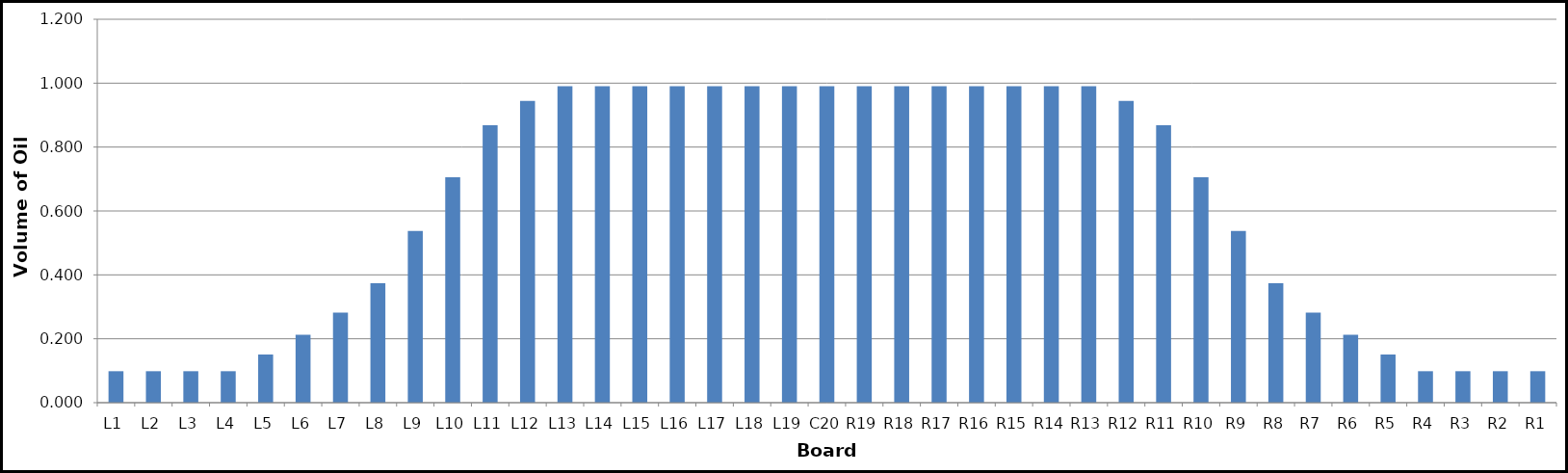
| Category | Series 0 |
|---|---|
| L1 | 0.099 |
| L2 | 0.099 |
| L3 | 0.099 |
| L4 | 0.099 |
| L5 | 0.151 |
| L6 | 0.213 |
| L7 | 0.282 |
| L8 | 0.374 |
| L9 | 0.537 |
| L10 | 0.705 |
| L11 | 0.869 |
| L12 | 0.945 |
| L13 | 0.99 |
| L14 | 0.99 |
| L15 | 0.99 |
| L16 | 0.99 |
| L17 | 0.99 |
| L18 | 0.99 |
| L19 | 0.99 |
| C20 | 0.99 |
| R19 | 0.99 |
| R18 | 0.99 |
| R17 | 0.99 |
| R16 | 0.99 |
| R15 | 0.99 |
| R14 | 0.99 |
| R13 | 0.99 |
| R12 | 0.945 |
| R11 | 0.869 |
| R10 | 0.705 |
| R9 | 0.537 |
| R8 | 0.374 |
| R7 | 0.282 |
| R6 | 0.213 |
| R5 | 0.151 |
| R4 | 0.099 |
| R3 | 0.099 |
| R2 | 0.099 |
| R1 | 0.099 |